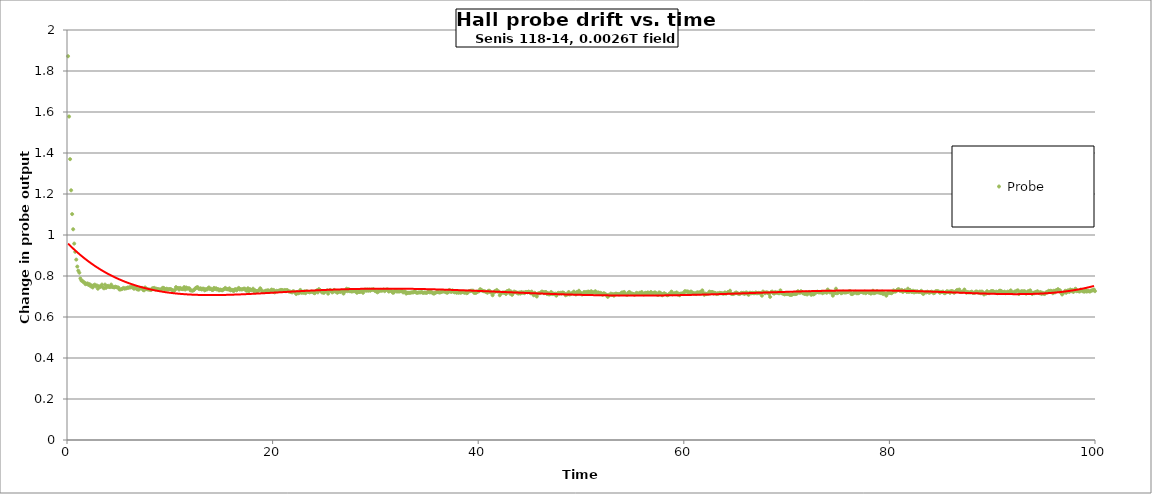
| Category | Probe |
|---|---|
| 0.1 | 1.872 |
| 0.2 | 1.578 |
| 0.30000000000000004 | 1.37 |
| 0.4 | 1.218 |
| 0.5 | 1.102 |
| 0.6 | 1.028 |
| 0.7 | 0.958 |
| 0.7999999999999999 | 0.918 |
| 0.8999999999999999 | 0.88 |
| 0.9999999999999999 | 0.846 |
| 1.0999999999999999 | 0.826 |
| 1.2 | 0.816 |
| 1.3 | 0.788 |
| 1.4000000000000001 | 0.778 |
| 1.5000000000000002 | 0.776 |
| 1.6000000000000003 | 0.77 |
| 1.7000000000000004 | 0.768 |
| 1.8000000000000005 | 0.76 |
| 1.9000000000000006 | 0.762 |
| 2.0000000000000004 | 0.764 |
| 2.1000000000000005 | 0.756 |
| 2.2000000000000006 | 0.76 |
| 2.3000000000000007 | 0.75 |
| 2.400000000000001 | 0.754 |
| 2.500000000000001 | 0.744 |
| 2.600000000000001 | 0.754 |
| 2.700000000000001 | 0.758 |
| 2.800000000000001 | 0.75 |
| 2.9000000000000012 | 0.754 |
| 3.0000000000000013 | 0.738 |
| 3.1000000000000014 | 0.75 |
| 3.2000000000000015 | 0.746 |
| 3.3000000000000016 | 0.75 |
| 3.4000000000000017 | 0.758 |
| 3.5000000000000018 | 0.744 |
| 3.600000000000002 | 0.74 |
| 3.700000000000002 | 0.758 |
| 3.800000000000002 | 0.742 |
| 3.900000000000002 | 0.75 |
| 4.000000000000002 | 0.752 |
| 4.100000000000001 | 0.746 |
| 4.200000000000001 | 0.746 |
| 4.300000000000001 | 0.758 |
| 4.4 | 0.746 |
| 4.5 | 0.746 |
| 4.6 | 0.744 |
| 4.699999999999999 | 0.748 |
| 4.799999999999999 | 0.746 |
| 4.899999999999999 | 0.744 |
| 4.999999999999998 | 0.744 |
| 5.099999999999998 | 0.734 |
| 5.1999999999999975 | 0.734 |
| 5.299999999999997 | 0.736 |
| 5.399999999999997 | 0.738 |
| 5.4999999999999964 | 0.742 |
| 5.599999999999996 | 0.738 |
| 5.699999999999996 | 0.74 |
| 5.799999999999995 | 0.74 |
| 5.899999999999995 | 0.744 |
| 5.999999999999995 | 0.742 |
| 6.099999999999994 | 0.746 |
| 6.199999999999994 | 0.744 |
| 6.299999999999994 | 0.748 |
| 6.399999999999993 | 0.746 |
| 6.499999999999993 | 0.738 |
| 6.5999999999999925 | 0.74 |
| 6.699999999999992 | 0.746 |
| 6.799999999999992 | 0.736 |
| 6.8999999999999915 | 0.734 |
| 6.999999999999991 | 0.734 |
| 7.099999999999991 | 0.74 |
| 7.19999999999999 | 0.742 |
| 7.29999999999999 | 0.742 |
| 7.39999999999999 | 0.732 |
| 7.499999999999989 | 0.73 |
| 7.599999999999989 | 0.744 |
| 7.699999999999989 | 0.736 |
| 7.799999999999988 | 0.736 |
| 7.899999999999988 | 0.734 |
| 7.999999999999988 | 0.734 |
| 8.099999999999987 | 0.732 |
| 8.199999999999987 | 0.732 |
| 8.299999999999986 | 0.74 |
| 8.399999999999986 | 0.74 |
| 8.499999999999986 | 0.742 |
| 8.599999999999985 | 0.734 |
| 8.699999999999985 | 0.738 |
| 8.799999999999985 | 0.736 |
| 8.899999999999984 | 0.736 |
| 8.999999999999984 | 0.734 |
| 9.099999999999984 | 0.734 |
| 9.199999999999983 | 0.734 |
| 9.299999999999983 | 0.742 |
| 9.399999999999983 | 0.742 |
| 9.499999999999982 | 0.734 |
| 9.599999999999982 | 0.736 |
| 9.699999999999982 | 0.738 |
| 9.799999999999981 | 0.734 |
| 9.89999999999998 | 0.736 |
| 9.99999999999998 | 0.736 |
| 10.09999999999998 | 0.736 |
| 10.19999999999998 | 0.732 |
| 10.29999999999998 | 0.73 |
| 10.399999999999979 | 0.728 |
| 10.499999999999979 | 0.732 |
| 10.599999999999978 | 0.746 |
| 10.699999999999978 | 0.74 |
| 10.799999999999978 | 0.742 |
| 10.899999999999977 | 0.734 |
| 10.999999999999977 | 0.742 |
| 11.099999999999977 | 0.738 |
| 11.199999999999976 | 0.736 |
| 11.299999999999976 | 0.736 |
| 11.399999999999975 | 0.746 |
| 11.499999999999975 | 0.734 |
| 11.599999999999975 | 0.744 |
| 11.699999999999974 | 0.738 |
| 11.799999999999974 | 0.74 |
| 11.899999999999974 | 0.74 |
| 11.999999999999973 | 0.73 |
| 12.099999999999973 | 0.73 |
| 12.199999999999973 | 0.728 |
| 12.299999999999972 | 0.73 |
| 12.399999999999972 | 0.734 |
| 12.499999999999972 | 0.74 |
| 12.599999999999971 | 0.744 |
| 12.69999999999997 | 0.746 |
| 12.79999999999997 | 0.738 |
| 12.89999999999997 | 0.736 |
| 12.99999999999997 | 0.74 |
| 13.09999999999997 | 0.734 |
| 13.199999999999969 | 0.738 |
| 13.299999999999969 | 0.738 |
| 13.399999999999968 | 0.73 |
| 13.499999999999968 | 0.736 |
| 13.599999999999968 | 0.734 |
| 13.699999999999967 | 0.738 |
| 13.799999999999967 | 0.744 |
| 13.899999999999967 | 0.736 |
| 13.999999999999966 | 0.738 |
| 14.099999999999966 | 0.732 |
| 14.199999999999966 | 0.732 |
| 14.299999999999965 | 0.742 |
| 14.399999999999965 | 0.736 |
| 14.499999999999964 | 0.74 |
| 14.599999999999964 | 0.734 |
| 14.699999999999964 | 0.736 |
| 14.799999999999963 | 0.73 |
| 14.899999999999963 | 0.734 |
| 14.999999999999963 | 0.732 |
| 15.099999999999962 | 0.73 |
| 15.199999999999962 | 0.734 |
| 15.299999999999962 | 0.736 |
| 15.399999999999961 | 0.742 |
| 15.499999999999961 | 0.736 |
| 15.59999999999996 | 0.736 |
| 15.69999999999996 | 0.734 |
| 15.79999999999996 | 0.74 |
| 15.89999999999996 | 0.73 |
| 15.99999999999996 | 0.732 |
| 16.09999999999996 | 0.732 |
| 16.19999999999996 | 0.726 |
| 16.29999999999996 | 0.734 |
| 16.399999999999963 | 0.736 |
| 16.499999999999964 | 0.73 |
| 16.599999999999966 | 0.736 |
| 16.699999999999967 | 0.742 |
| 16.79999999999997 | 0.734 |
| 16.89999999999997 | 0.736 |
| 16.99999999999997 | 0.734 |
| 17.099999999999973 | 0.736 |
| 17.199999999999974 | 0.738 |
| 17.299999999999976 | 0.738 |
| 17.399999999999977 | 0.73 |
| 17.49999999999998 | 0.728 |
| 17.59999999999998 | 0.74 |
| 17.69999999999998 | 0.726 |
| 17.799999999999983 | 0.736 |
| 17.899999999999984 | 0.732 |
| 17.999999999999986 | 0.732 |
| 18.099999999999987 | 0.738 |
| 18.19999999999999 | 0.726 |
| 18.29999999999999 | 0.73 |
| 18.39999999999999 | 0.726 |
| 18.499999999999993 | 0.726 |
| 18.599999999999994 | 0.728 |
| 18.699999999999996 | 0.732 |
| 18.799999999999997 | 0.74 |
| 18.9 | 0.732 |
| 19.0 | 0.722 |
| 19.1 | 0.724 |
| 19.200000000000003 | 0.722 |
| 19.300000000000004 | 0.728 |
| 19.400000000000006 | 0.728 |
| 19.500000000000007 | 0.73 |
| 19.60000000000001 | 0.73 |
| 19.70000000000001 | 0.722 |
| 19.80000000000001 | 0.726 |
| 19.900000000000013 | 0.734 |
| 20.000000000000014 | 0.726 |
| 20.100000000000016 | 0.732 |
| 20.200000000000017 | 0.72 |
| 20.30000000000002 | 0.724 |
| 20.40000000000002 | 0.728 |
| 20.50000000000002 | 0.726 |
| 20.600000000000023 | 0.728 |
| 20.700000000000024 | 0.73 |
| 20.800000000000026 | 0.732 |
| 20.900000000000027 | 0.732 |
| 21.00000000000003 | 0.73 |
| 21.10000000000003 | 0.728 |
| 21.20000000000003 | 0.732 |
| 21.300000000000033 | 0.726 |
| 21.400000000000034 | 0.732 |
| 21.500000000000036 | 0.728 |
| 21.600000000000037 | 0.724 |
| 21.70000000000004 | 0.724 |
| 21.80000000000004 | 0.722 |
| 21.90000000000004 | 0.72 |
| 22.000000000000043 | 0.726 |
| 22.100000000000044 | 0.724 |
| 22.200000000000045 | 0.72 |
| 22.300000000000047 | 0.712 |
| 22.40000000000005 | 0.722 |
| 22.50000000000005 | 0.716 |
| 22.60000000000005 | 0.718 |
| 22.700000000000053 | 0.732 |
| 22.800000000000054 | 0.718 |
| 22.900000000000055 | 0.72 |
| 23.000000000000057 | 0.718 |
| 23.10000000000006 | 0.726 |
| 23.20000000000006 | 0.716 |
| 23.30000000000006 | 0.726 |
| 23.400000000000063 | 0.724 |
| 23.500000000000064 | 0.722 |
| 23.600000000000065 | 0.72 |
| 23.700000000000067 | 0.722 |
| 23.800000000000068 | 0.724 |
| 23.90000000000007 | 0.722 |
| 24.00000000000007 | 0.718 |
| 24.100000000000072 | 0.716 |
| 24.200000000000074 | 0.726 |
| 24.300000000000075 | 0.73 |
| 24.400000000000077 | 0.72 |
| 24.500000000000078 | 0.736 |
| 24.60000000000008 | 0.732 |
| 24.70000000000008 | 0.726 |
| 24.800000000000082 | 0.72 |
| 24.900000000000084 | 0.72 |
| 25.000000000000085 | 0.718 |
| 25.100000000000087 | 0.726 |
| 25.200000000000088 | 0.726 |
| 25.30000000000009 | 0.73 |
| 25.40000000000009 | 0.714 |
| 25.500000000000092 | 0.728 |
| 25.600000000000094 | 0.732 |
| 25.700000000000095 | 0.726 |
| 25.800000000000097 | 0.72 |
| 25.900000000000098 | 0.724 |
| 26.0000000000001 | 0.732 |
| 26.1000000000001 | 0.724 |
| 26.200000000000102 | 0.724 |
| 26.300000000000104 | 0.718 |
| 26.400000000000105 | 0.722 |
| 26.500000000000107 | 0.726 |
| 26.600000000000108 | 0.722 |
| 26.70000000000011 | 0.728 |
| 26.80000000000011 | 0.724 |
| 26.900000000000112 | 0.714 |
| 27.000000000000114 | 0.726 |
| 27.100000000000115 | 0.726 |
| 27.200000000000117 | 0.738 |
| 27.300000000000118 | 0.726 |
| 27.40000000000012 | 0.736 |
| 27.50000000000012 | 0.726 |
| 27.600000000000122 | 0.726 |
| 27.700000000000124 | 0.724 |
| 27.800000000000125 | 0.726 |
| 27.900000000000126 | 0.726 |
| 28.000000000000128 | 0.726 |
| 28.10000000000013 | 0.726 |
| 28.20000000000013 | 0.718 |
| 28.300000000000132 | 0.724 |
| 28.400000000000134 | 0.722 |
| 28.500000000000135 | 0.722 |
| 28.600000000000136 | 0.732 |
| 28.700000000000138 | 0.724 |
| 28.80000000000014 | 0.718 |
| 28.90000000000014 | 0.73 |
| 29.000000000000142 | 0.734 |
| 29.100000000000144 | 0.728 |
| 29.200000000000145 | 0.734 |
| 29.300000000000146 | 0.728 |
| 29.400000000000148 | 0.734 |
| 29.50000000000015 | 0.728 |
| 29.60000000000015 | 0.734 |
| 29.700000000000152 | 0.732 |
| 29.800000000000153 | 0.736 |
| 29.900000000000155 | 0.73 |
| 30.000000000000156 | 0.726 |
| 30.100000000000158 | 0.726 |
| 30.20000000000016 | 0.72 |
| 30.30000000000016 | 0.73 |
| 30.400000000000162 | 0.726 |
| 30.500000000000163 | 0.732 |
| 30.600000000000165 | 0.728 |
| 30.700000000000166 | 0.73 |
| 30.800000000000168 | 0.734 |
| 30.90000000000017 | 0.726 |
| 31.00000000000017 | 0.732 |
| 31.100000000000172 | 0.734 |
| 31.200000000000173 | 0.734 |
| 31.300000000000175 | 0.724 |
| 31.400000000000176 | 0.728 |
| 31.500000000000178 | 0.728 |
| 31.60000000000018 | 0.726 |
| 31.70000000000018 | 0.718 |
| 31.800000000000182 | 0.72 |
| 31.900000000000183 | 0.73 |
| 32.000000000000185 | 0.73 |
| 32.100000000000186 | 0.724 |
| 32.20000000000019 | 0.726 |
| 32.30000000000019 | 0.724 |
| 32.40000000000019 | 0.726 |
| 32.50000000000019 | 0.726 |
| 32.60000000000019 | 0.728 |
| 32.700000000000195 | 0.72 |
| 32.800000000000196 | 0.724 |
| 32.9000000000002 | 0.724 |
| 33.0000000000002 | 0.714 |
| 33.1000000000002 | 0.718 |
| 33.2000000000002 | 0.718 |
| 33.3000000000002 | 0.718 |
| 33.400000000000205 | 0.718 |
| 33.500000000000206 | 0.72 |
| 33.60000000000021 | 0.72 |
| 33.70000000000021 | 0.72 |
| 33.80000000000021 | 0.726 |
| 33.90000000000021 | 0.722 |
| 34.00000000000021 | 0.718 |
| 34.100000000000215 | 0.718 |
| 34.200000000000216 | 0.72 |
| 34.30000000000022 | 0.72 |
| 34.40000000000022 | 0.72 |
| 34.50000000000022 | 0.722 |
| 34.60000000000022 | 0.718 |
| 34.70000000000022 | 0.718 |
| 34.800000000000225 | 0.72 |
| 34.900000000000226 | 0.718 |
| 35.00000000000023 | 0.718 |
| 35.10000000000023 | 0.722 |
| 35.20000000000023 | 0.724 |
| 35.30000000000023 | 0.72 |
| 35.40000000000023 | 0.722 |
| 35.500000000000234 | 0.72 |
| 35.600000000000236 | 0.716 |
| 35.70000000000024 | 0.714 |
| 35.80000000000024 | 0.718 |
| 35.90000000000024 | 0.72 |
| 36.00000000000024 | 0.722 |
| 36.10000000000024 | 0.722 |
| 36.200000000000244 | 0.72 |
| 36.300000000000246 | 0.72 |
| 36.40000000000025 | 0.722 |
| 36.50000000000025 | 0.724 |
| 36.60000000000025 | 0.724 |
| 36.70000000000025 | 0.726 |
| 36.80000000000025 | 0.722 |
| 36.900000000000254 | 0.72 |
| 37.000000000000256 | 0.718 |
| 37.10000000000026 | 0.722 |
| 37.20000000000026 | 0.732 |
| 37.30000000000026 | 0.724 |
| 37.40000000000026 | 0.722 |
| 37.50000000000026 | 0.73 |
| 37.600000000000264 | 0.724 |
| 37.700000000000266 | 0.72 |
| 37.80000000000027 | 0.726 |
| 37.90000000000027 | 0.718 |
| 38.00000000000027 | 0.726 |
| 38.10000000000027 | 0.718 |
| 38.20000000000027 | 0.724 |
| 38.300000000000274 | 0.718 |
| 38.400000000000276 | 0.722 |
| 38.50000000000028 | 0.722 |
| 38.60000000000028 | 0.72 |
| 38.70000000000028 | 0.718 |
| 38.80000000000028 | 0.724 |
| 38.90000000000028 | 0.716 |
| 39.000000000000284 | 0.72 |
| 39.100000000000286 | 0.726 |
| 39.20000000000029 | 0.726 |
| 39.30000000000029 | 0.728 |
| 39.40000000000029 | 0.728 |
| 39.50000000000029 | 0.728 |
| 39.60000000000029 | 0.718 |
| 39.700000000000294 | 0.718 |
| 39.800000000000296 | 0.718 |
| 39.9000000000003 | 0.724 |
| 40.0000000000003 | 0.724 |
| 40.1000000000003 | 0.726 |
| 40.2000000000003 | 0.736 |
| 40.3000000000003 | 0.732 |
| 40.400000000000304 | 0.728 |
| 40.500000000000306 | 0.726 |
| 40.60000000000031 | 0.726 |
| 40.70000000000031 | 0.724 |
| 40.80000000000031 | 0.722 |
| 40.90000000000031 | 0.718 |
| 41.00000000000031 | 0.728 |
| 41.100000000000314 | 0.728 |
| 41.200000000000315 | 0.72 |
| 41.30000000000032 | 0.72 |
| 41.40000000000032 | 0.706 |
| 41.50000000000032 | 0.718 |
| 41.60000000000032 | 0.726 |
| 41.70000000000032 | 0.724 |
| 41.800000000000324 | 0.732 |
| 41.900000000000325 | 0.724 |
| 42.00000000000033 | 0.724 |
| 42.10000000000033 | 0.706 |
| 42.20000000000033 | 0.716 |
| 42.30000000000033 | 0.718 |
| 42.40000000000033 | 0.72 |
| 42.500000000000334 | 0.718 |
| 42.600000000000335 | 0.72 |
| 42.70000000000034 | 0.712 |
| 42.80000000000034 | 0.726 |
| 42.90000000000034 | 0.726 |
| 43.00000000000034 | 0.73 |
| 43.10000000000034 | 0.714 |
| 43.200000000000344 | 0.724 |
| 43.300000000000345 | 0.708 |
| 43.40000000000035 | 0.716 |
| 43.50000000000035 | 0.724 |
| 43.60000000000035 | 0.722 |
| 43.70000000000035 | 0.72 |
| 43.80000000000035 | 0.718 |
| 43.900000000000354 | 0.714 |
| 44.000000000000355 | 0.72 |
| 44.10000000000036 | 0.714 |
| 44.20000000000036 | 0.722 |
| 44.30000000000036 | 0.718 |
| 44.40000000000036 | 0.72 |
| 44.50000000000036 | 0.716 |
| 44.600000000000364 | 0.722 |
| 44.700000000000365 | 0.722 |
| 44.80000000000037 | 0.72 |
| 44.90000000000037 | 0.724 |
| 45.00000000000037 | 0.72 |
| 45.10000000000037 | 0.716 |
| 45.20000000000037 | 0.724 |
| 45.300000000000374 | 0.714 |
| 45.400000000000375 | 0.706 |
| 45.50000000000038 | 0.718 |
| 45.60000000000038 | 0.712 |
| 45.70000000000038 | 0.7 |
| 45.80000000000038 | 0.714 |
| 45.90000000000038 | 0.716 |
| 46.000000000000384 | 0.716 |
| 46.100000000000385 | 0.72 |
| 46.20000000000039 | 0.724 |
| 46.30000000000039 | 0.722 |
| 46.40000000000039 | 0.716 |
| 46.50000000000039 | 0.722 |
| 46.60000000000039 | 0.722 |
| 46.700000000000394 | 0.712 |
| 46.800000000000395 | 0.716 |
| 46.9000000000004 | 0.71 |
| 47.0000000000004 | 0.712 |
| 47.1000000000004 | 0.722 |
| 47.2000000000004 | 0.712 |
| 47.3000000000004 | 0.714 |
| 47.400000000000404 | 0.712 |
| 47.500000000000405 | 0.714 |
| 47.600000000000406 | 0.704 |
| 47.70000000000041 | 0.714 |
| 47.80000000000041 | 0.718 |
| 47.90000000000041 | 0.714 |
| 48.00000000000041 | 0.718 |
| 48.10000000000041 | 0.714 |
| 48.200000000000415 | 0.72 |
| 48.300000000000416 | 0.718 |
| 48.40000000000042 | 0.714 |
| 48.50000000000042 | 0.706 |
| 48.60000000000042 | 0.712 |
| 48.70000000000042 | 0.71 |
| 48.80000000000042 | 0.722 |
| 48.900000000000425 | 0.71 |
| 49.000000000000426 | 0.712 |
| 49.10000000000043 | 0.716 |
| 49.20000000000043 | 0.716 |
| 49.30000000000043 | 0.724 |
| 49.40000000000043 | 0.718 |
| 49.50000000000043 | 0.71 |
| 49.600000000000435 | 0.722 |
| 49.700000000000436 | 0.716 |
| 49.80000000000044 | 0.728 |
| 49.90000000000044 | 0.72 |
| 50.00000000000044 | 0.716 |
| 50.10000000000044 | 0.71 |
| 50.20000000000044 | 0.712 |
| 50.300000000000445 | 0.722 |
| 50.400000000000446 | 0.718 |
| 50.50000000000045 | 0.722 |
| 50.60000000000045 | 0.718 |
| 50.70000000000045 | 0.724 |
| 50.80000000000045 | 0.722 |
| 50.90000000000045 | 0.718 |
| 51.000000000000455 | 0.726 |
| 51.100000000000456 | 0.716 |
| 51.20000000000046 | 0.72 |
| 51.30000000000046 | 0.72 |
| 51.40000000000046 | 0.726 |
| 51.50000000000046 | 0.716 |
| 51.60000000000046 | 0.718 |
| 51.700000000000465 | 0.72 |
| 51.800000000000466 | 0.712 |
| 51.90000000000047 | 0.718 |
| 52.00000000000047 | 0.714 |
| 52.10000000000047 | 0.708 |
| 52.20000000000047 | 0.716 |
| 52.30000000000047 | 0.714 |
| 52.400000000000475 | 0.71 |
| 52.500000000000476 | 0.708 |
| 52.60000000000048 | 0.698 |
| 52.70000000000048 | 0.708 |
| 52.80000000000048 | 0.708 |
| 52.90000000000048 | 0.714 |
| 53.00000000000048 | 0.708 |
| 53.100000000000485 | 0.712 |
| 53.200000000000486 | 0.704 |
| 53.30000000000049 | 0.712 |
| 53.40000000000049 | 0.714 |
| 53.50000000000049 | 0.712 |
| 53.60000000000049 | 0.712 |
| 53.70000000000049 | 0.71 |
| 53.800000000000495 | 0.712 |
| 53.900000000000496 | 0.716 |
| 54.0000000000005 | 0.72 |
| 54.1000000000005 | 0.712 |
| 54.2000000000005 | 0.722 |
| 54.3000000000005 | 0.712 |
| 54.4000000000005 | 0.71 |
| 54.500000000000504 | 0.708 |
| 54.600000000000506 | 0.718 |
| 54.70000000000051 | 0.722 |
| 54.80000000000051 | 0.718 |
| 54.90000000000051 | 0.712 |
| 55.00000000000051 | 0.714 |
| 55.10000000000051 | 0.712 |
| 55.200000000000514 | 0.708 |
| 55.300000000000516 | 0.712 |
| 55.40000000000052 | 0.718 |
| 55.50000000000052 | 0.714 |
| 55.60000000000052 | 0.712 |
| 55.70000000000052 | 0.718 |
| 55.80000000000052 | 0.716 |
| 55.900000000000524 | 0.722 |
| 56.000000000000526 | 0.714 |
| 56.10000000000053 | 0.71 |
| 56.20000000000053 | 0.716 |
| 56.30000000000053 | 0.718 |
| 56.40000000000053 | 0.714 |
| 56.50000000000053 | 0.72 |
| 56.600000000000534 | 0.712 |
| 56.700000000000536 | 0.716 |
| 56.80000000000054 | 0.722 |
| 56.90000000000054 | 0.716 |
| 57.00000000000054 | 0.714 |
| 57.10000000000054 | 0.718 |
| 57.20000000000054 | 0.72 |
| 57.300000000000544 | 0.716 |
| 57.400000000000546 | 0.71 |
| 57.50000000000055 | 0.708 |
| 57.60000000000055 | 0.72 |
| 57.70000000000055 | 0.718 |
| 57.80000000000055 | 0.714 |
| 57.90000000000055 | 0.706 |
| 58.000000000000554 | 0.712 |
| 58.100000000000556 | 0.716 |
| 58.20000000000056 | 0.712 |
| 58.30000000000056 | 0.71 |
| 58.40000000000056 | 0.706 |
| 58.50000000000056 | 0.708 |
| 58.60000000000056 | 0.714 |
| 58.700000000000564 | 0.714 |
| 58.800000000000566 | 0.724 |
| 58.90000000000057 | 0.71 |
| 59.00000000000057 | 0.714 |
| 59.10000000000057 | 0.716 |
| 59.20000000000057 | 0.712 |
| 59.30000000000057 | 0.72 |
| 59.400000000000574 | 0.71 |
| 59.500000000000576 | 0.714 |
| 59.60000000000058 | 0.706 |
| 59.70000000000058 | 0.714 |
| 59.80000000000058 | 0.714 |
| 59.90000000000058 | 0.716 |
| 60.00000000000058 | 0.712 |
| 60.100000000000584 | 0.726 |
| 60.200000000000585 | 0.724 |
| 60.30000000000059 | 0.724 |
| 60.40000000000059 | 0.724 |
| 60.50000000000059 | 0.716 |
| 60.60000000000059 | 0.72 |
| 60.70000000000059 | 0.724 |
| 60.800000000000594 | 0.72 |
| 60.900000000000595 | 0.716 |
| 61.0000000000006 | 0.714 |
| 61.1000000000006 | 0.716 |
| 61.2000000000006 | 0.712 |
| 61.3000000000006 | 0.72 |
| 61.4000000000006 | 0.72 |
| 61.500000000000604 | 0.716 |
| 61.600000000000605 | 0.722 |
| 61.70000000000061 | 0.72 |
| 61.80000000000061 | 0.73 |
| 61.90000000000061 | 0.718 |
| 62.00000000000061 | 0.708 |
| 62.10000000000061 | 0.714 |
| 62.200000000000614 | 0.712 |
| 62.300000000000615 | 0.714 |
| 62.40000000000062 | 0.714 |
| 62.50000000000062 | 0.724 |
| 62.60000000000062 | 0.716 |
| 62.70000000000062 | 0.722 |
| 62.80000000000062 | 0.722 |
| 62.900000000000624 | 0.714 |
| 63.000000000000625 | 0.718 |
| 63.10000000000063 | 0.716 |
| 63.20000000000063 | 0.712 |
| 63.30000000000063 | 0.716 |
| 63.40000000000063 | 0.714 |
| 63.50000000000063 | 0.718 |
| 63.600000000000634 | 0.716 |
| 63.700000000000635 | 0.716 |
| 63.80000000000064 | 0.714 |
| 63.90000000000064 | 0.714 |
| 64.00000000000064 | 0.72 |
| 64.10000000000063 | 0.714 |
| 64.20000000000063 | 0.716 |
| 64.30000000000062 | 0.722 |
| 64.40000000000062 | 0.72 |
| 64.50000000000061 | 0.728 |
| 64.6000000000006 | 0.714 |
| 64.7000000000006 | 0.712 |
| 64.8000000000006 | 0.712 |
| 64.90000000000059 | 0.714 |
| 65.00000000000058 | 0.716 |
| 65.10000000000058 | 0.72 |
| 65.20000000000057 | 0.716 |
| 65.30000000000057 | 0.714 |
| 65.40000000000056 | 0.712 |
| 65.50000000000055 | 0.714 |
| 65.60000000000055 | 0.718 |
| 65.70000000000054 | 0.716 |
| 65.80000000000054 | 0.718 |
| 65.90000000000053 | 0.712 |
| 66.00000000000053 | 0.718 |
| 66.10000000000052 | 0.72 |
| 66.20000000000051 | 0.714 |
| 66.30000000000051 | 0.708 |
| 66.4000000000005 | 0.718 |
| 66.5000000000005 | 0.718 |
| 66.60000000000049 | 0.716 |
| 66.70000000000049 | 0.718 |
| 66.80000000000048 | 0.716 |
| 66.90000000000047 | 0.716 |
| 67.00000000000047 | 0.72 |
| 67.10000000000046 | 0.716 |
| 67.20000000000046 | 0.716 |
| 67.30000000000045 | 0.718 |
| 67.40000000000045 | 0.716 |
| 67.50000000000044 | 0.716 |
| 67.60000000000043 | 0.704 |
| 67.70000000000043 | 0.724 |
| 67.80000000000042 | 0.72 |
| 67.90000000000042 | 0.716 |
| 68.00000000000041 | 0.72 |
| 68.1000000000004 | 0.72 |
| 68.2000000000004 | 0.718 |
| 68.3000000000004 | 0.712 |
| 68.40000000000039 | 0.698 |
| 68.50000000000038 | 0.722 |
| 68.60000000000038 | 0.724 |
| 68.70000000000037 | 0.716 |
| 68.80000000000037 | 0.714 |
| 68.90000000000036 | 0.722 |
| 69.00000000000036 | 0.718 |
| 69.10000000000035 | 0.72 |
| 69.20000000000034 | 0.716 |
| 69.30000000000034 | 0.716 |
| 69.40000000000033 | 0.73 |
| 69.50000000000033 | 0.718 |
| 69.60000000000032 | 0.714 |
| 69.70000000000032 | 0.714 |
| 69.80000000000031 | 0.71 |
| 69.9000000000003 | 0.714 |
| 70.0000000000003 | 0.712 |
| 70.10000000000029 | 0.712 |
| 70.20000000000029 | 0.712 |
| 70.30000000000028 | 0.708 |
| 70.40000000000028 | 0.708 |
| 70.50000000000027 | 0.708 |
| 70.60000000000026 | 0.712 |
| 70.70000000000026 | 0.714 |
| 70.80000000000025 | 0.712 |
| 70.90000000000025 | 0.712 |
| 71.00000000000024 | 0.714 |
| 71.10000000000024 | 0.726 |
| 71.20000000000023 | 0.72 |
| 71.30000000000022 | 0.718 |
| 71.40000000000022 | 0.726 |
| 71.50000000000021 | 0.72 |
| 71.60000000000021 | 0.716 |
| 71.7000000000002 | 0.714 |
| 71.8000000000002 | 0.712 |
| 71.90000000000019 | 0.72 |
| 72.00000000000018 | 0.71 |
| 72.10000000000018 | 0.716 |
| 72.20000000000017 | 0.722 |
| 72.30000000000017 | 0.716 |
| 72.40000000000016 | 0.708 |
| 72.50000000000016 | 0.718 |
| 72.60000000000015 | 0.71 |
| 72.70000000000014 | 0.712 |
| 72.80000000000014 | 0.722 |
| 72.90000000000013 | 0.72 |
| 73.00000000000013 | 0.724 |
| 73.10000000000012 | 0.72 |
| 73.20000000000012 | 0.72 |
| 73.30000000000011 | 0.72 |
| 73.4000000000001 | 0.724 |
| 73.5000000000001 | 0.716 |
| 73.6000000000001 | 0.722 |
| 73.70000000000009 | 0.72 |
| 73.80000000000008 | 0.722 |
| 73.90000000000008 | 0.718 |
| 74.00000000000007 | 0.734 |
| 74.10000000000007 | 0.726 |
| 74.20000000000006 | 0.72 |
| 74.30000000000005 | 0.724 |
| 74.40000000000005 | 0.716 |
| 74.50000000000004 | 0.704 |
| 74.60000000000004 | 0.72 |
| 74.70000000000003 | 0.716 |
| 74.80000000000003 | 0.738 |
| 74.90000000000002 | 0.716 |
| 75.00000000000001 | 0.718 |
| 75.10000000000001 | 0.722 |
| 75.2 | 0.722 |
| 75.3 | 0.716 |
| 75.39999999999999 | 0.718 |
| 75.49999999999999 | 0.724 |
| 75.59999999999998 | 0.72 |
| 75.69999999999997 | 0.72 |
| 75.79999999999997 | 0.72 |
| 75.89999999999996 | 0.722 |
| 75.99999999999996 | 0.722 |
| 76.09999999999995 | 0.726 |
| 76.19999999999995 | 0.726 |
| 76.29999999999994 | 0.712 |
| 76.39999999999993 | 0.712 |
| 76.49999999999993 | 0.716 |
| 76.59999999999992 | 0.72 |
| 76.69999999999992 | 0.724 |
| 76.79999999999991 | 0.716 |
| 76.8999999999999 | 0.716 |
| 76.9999999999999 | 0.716 |
| 77.0999999999999 | 0.72 |
| 77.19999999999989 | 0.722 |
| 77.29999999999988 | 0.722 |
| 77.39999999999988 | 0.72 |
| 77.49999999999987 | 0.718 |
| 77.59999999999987 | 0.724 |
| 77.69999999999986 | 0.716 |
| 77.79999999999986 | 0.722 |
| 77.89999999999985 | 0.722 |
| 77.99999999999984 | 0.718 |
| 78.09999999999984 | 0.722 |
| 78.19999999999983 | 0.714 |
| 78.29999999999983 | 0.718 |
| 78.39999999999982 | 0.728 |
| 78.49999999999982 | 0.716 |
| 78.59999999999981 | 0.718 |
| 78.6999999999998 | 0.72 |
| 78.7999999999998 | 0.726 |
| 78.89999999999979 | 0.72 |
| 78.99999999999979 | 0.72 |
| 79.09999999999978 | 0.718 |
| 79.19999999999978 | 0.716 |
| 79.29999999999977 | 0.724 |
| 79.39999999999976 | 0.712 |
| 79.49999999999976 | 0.716 |
| 79.59999999999975 | 0.714 |
| 79.69999999999975 | 0.704 |
| 79.79999999999974 | 0.714 |
| 79.89999999999974 | 0.722 |
| 79.99999999999973 | 0.718 |
| 80.09999999999972 | 0.718 |
| 80.19999999999972 | 0.716 |
| 80.29999999999971 | 0.72 |
| 80.39999999999971 | 0.73 |
| 80.4999999999997 | 0.724 |
| 80.5999999999997 | 0.724 |
| 80.69999999999969 | 0.728 |
| 80.79999999999968 | 0.734 |
| 80.89999999999968 | 0.736 |
| 80.99999999999967 | 0.728 |
| 81.09999999999967 | 0.728 |
| 81.19999999999966 | 0.732 |
| 81.29999999999966 | 0.722 |
| 81.39999999999965 | 0.726 |
| 81.49999999999964 | 0.73 |
| 81.59999999999964 | 0.728 |
| 81.69999999999963 | 0.722 |
| 81.79999999999963 | 0.738 |
| 81.89999999999962 | 0.722 |
| 81.99999999999962 | 0.732 |
| 82.09999999999961 | 0.724 |
| 82.1999999999996 | 0.722 |
| 82.2999999999996 | 0.728 |
| 82.3999999999996 | 0.72 |
| 82.49999999999959 | 0.726 |
| 82.59999999999958 | 0.722 |
| 82.69999999999958 | 0.726 |
| 82.79999999999957 | 0.722 |
| 82.89999999999957 | 0.722 |
| 82.99999999999956 | 0.722 |
| 83.09999999999955 | 0.728 |
| 83.19999999999955 | 0.718 |
| 83.29999999999954 | 0.712 |
| 83.39999999999954 | 0.718 |
| 83.49999999999953 | 0.722 |
| 83.59999999999953 | 0.72 |
| 83.69999999999952 | 0.724 |
| 83.79999999999951 | 0.72 |
| 83.89999999999951 | 0.718 |
| 83.9999999999995 | 0.722 |
| 84.0999999999995 | 0.724 |
| 84.19999999999949 | 0.722 |
| 84.29999999999949 | 0.716 |
| 84.39999999999948 | 0.718 |
| 84.49999999999947 | 0.726 |
| 84.59999999999947 | 0.726 |
| 84.69999999999946 | 0.726 |
| 84.79999999999946 | 0.724 |
| 84.89999999999945 | 0.718 |
| 84.99999999999945 | 0.722 |
| 85.09999999999944 | 0.722 |
| 85.19999999999943 | 0.724 |
| 85.29999999999943 | 0.718 |
| 85.39999999999942 | 0.716 |
| 85.49999999999942 | 0.72 |
| 85.59999999999941 | 0.726 |
| 85.6999999999994 | 0.722 |
| 85.7999999999994 | 0.724 |
| 85.8999999999994 | 0.718 |
| 85.99999999999939 | 0.726 |
| 86.09999999999938 | 0.726 |
| 86.19999999999938 | 0.724 |
| 86.29999999999937 | 0.718 |
| 86.39999999999937 | 0.722 |
| 86.49999999999936 | 0.728 |
| 86.59999999999935 | 0.732 |
| 86.69999999999935 | 0.728 |
| 86.79999999999934 | 0.734 |
| 86.89999999999934 | 0.722 |
| 86.99999999999933 | 0.722 |
| 87.09999999999933 | 0.722 |
| 87.19999999999932 | 0.726 |
| 87.29999999999932 | 0.734 |
| 87.39999999999931 | 0.724 |
| 87.4999999999993 | 0.718 |
| 87.5999999999993 | 0.722 |
| 87.69999999999929 | 0.72 |
| 87.79999999999929 | 0.72 |
| 87.89999999999928 | 0.72 |
| 87.99999999999928 | 0.724 |
| 88.09999999999927 | 0.718 |
| 88.19999999999926 | 0.718 |
| 88.29999999999926 | 0.718 |
| 88.39999999999925 | 0.724 |
| 88.49999999999925 | 0.724 |
| 88.59999999999924 | 0.72 |
| 88.69999999999924 | 0.718 |
| 88.79999999999923 | 0.724 |
| 88.89999999999922 | 0.716 |
| 88.99999999999922 | 0.724 |
| 89.09999999999921 | 0.72 |
| 89.1999999999992 | 0.71 |
| 89.2999999999992 | 0.716 |
| 89.3999999999992 | 0.714 |
| 89.49999999999919 | 0.726 |
| 89.59999999999918 | 0.72 |
| 89.69999999999918 | 0.716 |
| 89.79999999999917 | 0.722 |
| 89.89999999999917 | 0.726 |
| 89.99999999999916 | 0.726 |
| 90.09999999999916 | 0.726 |
| 90.19999999999915 | 0.722 |
| 90.29999999999914 | 0.718 |
| 90.39999999999914 | 0.724 |
| 90.49999999999913 | 0.716 |
| 90.59999999999913 | 0.722 |
| 90.69999999999912 | 0.728 |
| 90.79999999999912 | 0.728 |
| 90.89999999999911 | 0.726 |
| 90.9999999999991 | 0.72 |
| 91.0999999999991 | 0.72 |
| 91.1999999999991 | 0.724 |
| 91.29999999999909 | 0.716 |
| 91.39999999999908 | 0.718 |
| 91.49999999999908 | 0.724 |
| 91.59999999999907 | 0.72 |
| 91.69999999999906 | 0.718 |
| 91.79999999999906 | 0.73 |
| 91.89999999999905 | 0.722 |
| 91.99999999999905 | 0.716 |
| 92.09999999999904 | 0.72 |
| 92.19999999999904 | 0.724 |
| 92.29999999999903 | 0.724 |
| 92.39999999999903 | 0.728 |
| 92.49999999999902 | 0.73 |
| 92.59999999999901 | 0.712 |
| 92.69999999999901 | 0.72 |
| 92.799999999999 | 0.724 |
| 92.899999999999 | 0.726 |
| 92.99999999999899 | 0.72 |
| 93.09999999999899 | 0.726 |
| 93.19999999999898 | 0.724 |
| 93.29999999999897 | 0.714 |
| 93.39999999999897 | 0.718 |
| 93.49999999999896 | 0.726 |
| 93.59999999999896 | 0.72 |
| 93.69999999999895 | 0.73 |
| 93.79999999999895 | 0.72 |
| 93.89999999999894 | 0.712 |
| 93.99999999999893 | 0.718 |
| 94.09999999999893 | 0.716 |
| 94.19999999999892 | 0.722 |
| 94.29999999999892 | 0.72 |
| 94.39999999999891 | 0.726 |
| 94.4999999999989 | 0.72 |
| 94.5999999999989 | 0.716 |
| 94.6999999999989 | 0.722 |
| 94.79999999999889 | 0.712 |
| 94.89999999999888 | 0.718 |
| 94.99999999999888 | 0.714 |
| 95.09999999999887 | 0.712 |
| 95.19999999999887 | 0.718 |
| 95.29999999999886 | 0.722 |
| 95.39999999999885 | 0.72 |
| 95.49999999999885 | 0.728 |
| 95.59999999999884 | 0.724 |
| 95.69999999999884 | 0.728 |
| 95.79999999999883 | 0.726 |
| 95.89999999999883 | 0.716 |
| 95.99999999999882 | 0.728 |
| 96.09999999999881 | 0.72 |
| 96.19999999999881 | 0.73 |
| 96.2999999999988 | 0.73 |
| 96.3999999999988 | 0.736 |
| 96.49999999999879 | 0.728 |
| 96.59999999999879 | 0.73 |
| 96.69999999999878 | 0.718 |
| 96.79999999999878 | 0.71 |
| 96.89999999999877 | 0.718 |
| 96.99999999999876 | 0.72 |
| 97.09999999999876 | 0.728 |
| 97.19999999999875 | 0.718 |
| 97.29999999999875 | 0.728 |
| 97.39999999999874 | 0.73 |
| 97.49999999999874 | 0.722 |
| 97.59999999999873 | 0.734 |
| 97.69999999999872 | 0.726 |
| 97.79999999999872 | 0.732 |
| 97.89999999999871 | 0.722 |
| 97.9999999999987 | 0.73 |
| 98.0999999999987 | 0.738 |
| 98.1999999999987 | 0.726 |
| 98.29999999999869 | 0.728 |
| 98.39999999999868 | 0.726 |
| 98.49999999999868 | 0.724 |
| 98.59999999999867 | 0.734 |
| 98.69999999999867 | 0.73 |
| 98.79999999999866 | 0.726 |
| 98.89999999999866 | 0.724 |
| 98.99999999999865 | 0.724 |
| 99.09999999999864 | 0.732 |
| 99.19999999999864 | 0.724 |
| 99.29999999999863 | 0.728 |
| 99.39999999999863 | 0.726 |
| 99.49999999999862 | 0.724 |
| 99.59999999999862 | 0.728 |
| 99.69999999999861 | 0.73 |
| 99.7999999999986 | 0.73 |
| 99.8999999999986 | 0.734 |
| 99.9999999999986 | 0.726 |